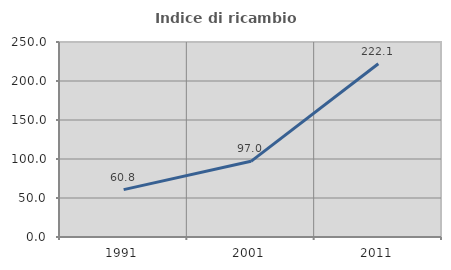
| Category | Indice di ricambio occupazionale  |
|---|---|
| 1991.0 | 60.751 |
| 2001.0 | 97.018 |
| 2011.0 | 222.065 |